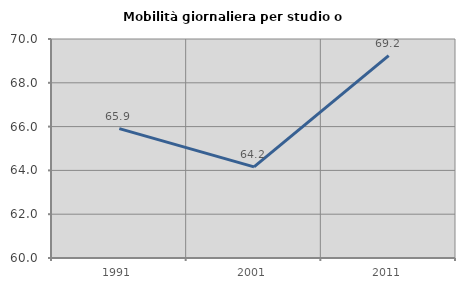
| Category | Mobilità giornaliera per studio o lavoro |
|---|---|
| 1991.0 | 65.909 |
| 2001.0 | 64.161 |
| 2011.0 | 69.243 |